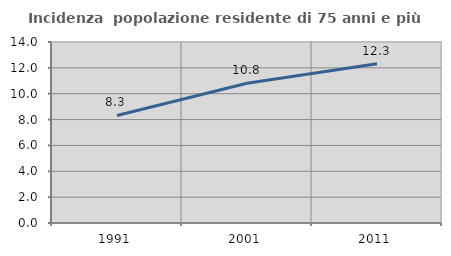
| Category | Incidenza  popolazione residente di 75 anni e più |
|---|---|
| 1991.0 | 8.317 |
| 2001.0 | 10.809 |
| 2011.0 | 12.31 |